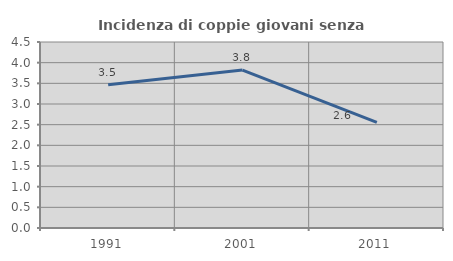
| Category | Incidenza di coppie giovani senza figli |
|---|---|
| 1991.0 | 3.467 |
| 2001.0 | 3.822 |
| 2011.0 | 2.556 |